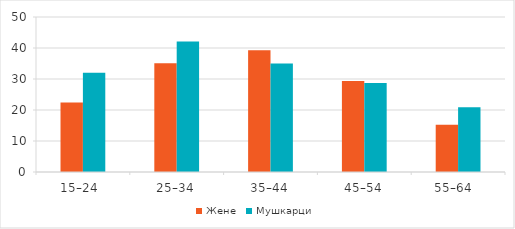
| Category | Жене | Мушкарци |
|---|---|---|
| 15–24  | 22.439 | 32.011 |
| 25–34 | 35.072 | 42.129 |
| 35–44 | 39.246 | 35.032 |
| 45–54 | 29.319 | 28.739 |
| 55–64   | 15.236 | 20.852 |